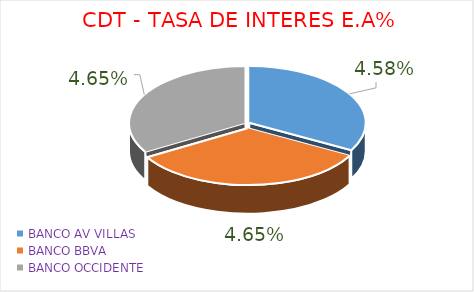
| Category | Series 0 |
|---|---|
| BANCO AV VILLAS                       | 4.58 |
| BANCO BBVA                              | 4.65 |
| BANCO OCCIDENTE                    | 4.65 |